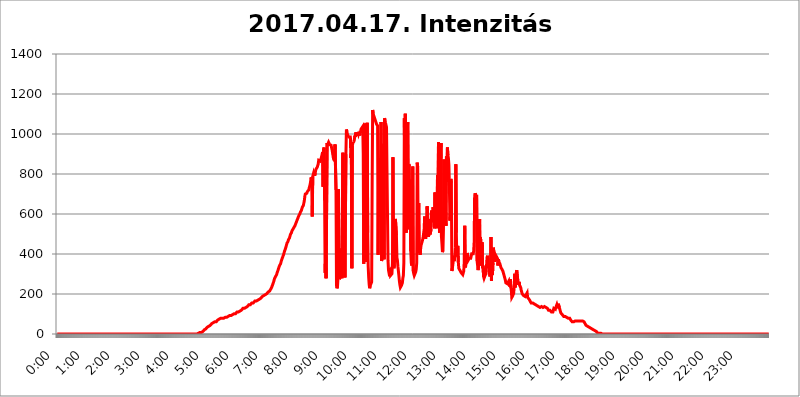
| Category | 2017.04.17. Intenzitás [W/m^2] |
|---|---|
| 0.0 | 0 |
| 0.0006944444444444445 | 0 |
| 0.001388888888888889 | 0 |
| 0.0020833333333333333 | 0 |
| 0.002777777777777778 | 0 |
| 0.003472222222222222 | 0 |
| 0.004166666666666667 | 0 |
| 0.004861111111111111 | 0 |
| 0.005555555555555556 | 0 |
| 0.0062499999999999995 | 0 |
| 0.006944444444444444 | 0 |
| 0.007638888888888889 | 0 |
| 0.008333333333333333 | 0 |
| 0.009027777777777779 | 0 |
| 0.009722222222222222 | 0 |
| 0.010416666666666666 | 0 |
| 0.011111111111111112 | 0 |
| 0.011805555555555555 | 0 |
| 0.012499999999999999 | 0 |
| 0.013194444444444444 | 0 |
| 0.013888888888888888 | 0 |
| 0.014583333333333332 | 0 |
| 0.015277777777777777 | 0 |
| 0.015972222222222224 | 0 |
| 0.016666666666666666 | 0 |
| 0.017361111111111112 | 0 |
| 0.018055555555555557 | 0 |
| 0.01875 | 0 |
| 0.019444444444444445 | 0 |
| 0.02013888888888889 | 0 |
| 0.020833333333333332 | 0 |
| 0.02152777777777778 | 0 |
| 0.022222222222222223 | 0 |
| 0.02291666666666667 | 0 |
| 0.02361111111111111 | 0 |
| 0.024305555555555556 | 0 |
| 0.024999999999999998 | 0 |
| 0.025694444444444447 | 0 |
| 0.02638888888888889 | 0 |
| 0.027083333333333334 | 0 |
| 0.027777777777777776 | 0 |
| 0.02847222222222222 | 0 |
| 0.029166666666666664 | 0 |
| 0.029861111111111113 | 0 |
| 0.030555555555555555 | 0 |
| 0.03125 | 0 |
| 0.03194444444444445 | 0 |
| 0.03263888888888889 | 0 |
| 0.03333333333333333 | 0 |
| 0.034027777777777775 | 0 |
| 0.034722222222222224 | 0 |
| 0.035416666666666666 | 0 |
| 0.036111111111111115 | 0 |
| 0.03680555555555556 | 0 |
| 0.0375 | 0 |
| 0.03819444444444444 | 0 |
| 0.03888888888888889 | 0 |
| 0.03958333333333333 | 0 |
| 0.04027777777777778 | 0 |
| 0.04097222222222222 | 0 |
| 0.041666666666666664 | 0 |
| 0.042361111111111106 | 0 |
| 0.04305555555555556 | 0 |
| 0.043750000000000004 | 0 |
| 0.044444444444444446 | 0 |
| 0.04513888888888889 | 0 |
| 0.04583333333333334 | 0 |
| 0.04652777777777778 | 0 |
| 0.04722222222222222 | 0 |
| 0.04791666666666666 | 0 |
| 0.04861111111111111 | 0 |
| 0.049305555555555554 | 0 |
| 0.049999999999999996 | 0 |
| 0.05069444444444445 | 0 |
| 0.051388888888888894 | 0 |
| 0.052083333333333336 | 0 |
| 0.05277777777777778 | 0 |
| 0.05347222222222222 | 0 |
| 0.05416666666666667 | 0 |
| 0.05486111111111111 | 0 |
| 0.05555555555555555 | 0 |
| 0.05625 | 0 |
| 0.05694444444444444 | 0 |
| 0.057638888888888885 | 0 |
| 0.05833333333333333 | 0 |
| 0.05902777777777778 | 0 |
| 0.059722222222222225 | 0 |
| 0.06041666666666667 | 0 |
| 0.061111111111111116 | 0 |
| 0.06180555555555556 | 0 |
| 0.0625 | 0 |
| 0.06319444444444444 | 0 |
| 0.06388888888888888 | 0 |
| 0.06458333333333334 | 0 |
| 0.06527777777777778 | 0 |
| 0.06597222222222222 | 0 |
| 0.06666666666666667 | 0 |
| 0.06736111111111111 | 0 |
| 0.06805555555555555 | 0 |
| 0.06874999999999999 | 0 |
| 0.06944444444444443 | 0 |
| 0.07013888888888889 | 0 |
| 0.07083333333333333 | 0 |
| 0.07152777777777779 | 0 |
| 0.07222222222222223 | 0 |
| 0.07291666666666667 | 0 |
| 0.07361111111111111 | 0 |
| 0.07430555555555556 | 0 |
| 0.075 | 0 |
| 0.07569444444444444 | 0 |
| 0.0763888888888889 | 0 |
| 0.07708333333333334 | 0 |
| 0.07777777777777778 | 0 |
| 0.07847222222222222 | 0 |
| 0.07916666666666666 | 0 |
| 0.0798611111111111 | 0 |
| 0.08055555555555556 | 0 |
| 0.08125 | 0 |
| 0.08194444444444444 | 0 |
| 0.08263888888888889 | 0 |
| 0.08333333333333333 | 0 |
| 0.08402777777777777 | 0 |
| 0.08472222222222221 | 0 |
| 0.08541666666666665 | 0 |
| 0.08611111111111112 | 0 |
| 0.08680555555555557 | 0 |
| 0.08750000000000001 | 0 |
| 0.08819444444444445 | 0 |
| 0.08888888888888889 | 0 |
| 0.08958333333333333 | 0 |
| 0.09027777777777778 | 0 |
| 0.09097222222222222 | 0 |
| 0.09166666666666667 | 0 |
| 0.09236111111111112 | 0 |
| 0.09305555555555556 | 0 |
| 0.09375 | 0 |
| 0.09444444444444444 | 0 |
| 0.09513888888888888 | 0 |
| 0.09583333333333333 | 0 |
| 0.09652777777777777 | 0 |
| 0.09722222222222222 | 0 |
| 0.09791666666666667 | 0 |
| 0.09861111111111111 | 0 |
| 0.09930555555555555 | 0 |
| 0.09999999999999999 | 0 |
| 0.10069444444444443 | 0 |
| 0.1013888888888889 | 0 |
| 0.10208333333333335 | 0 |
| 0.10277777777777779 | 0 |
| 0.10347222222222223 | 0 |
| 0.10416666666666667 | 0 |
| 0.10486111111111111 | 0 |
| 0.10555555555555556 | 0 |
| 0.10625 | 0 |
| 0.10694444444444444 | 0 |
| 0.1076388888888889 | 0 |
| 0.10833333333333334 | 0 |
| 0.10902777777777778 | 0 |
| 0.10972222222222222 | 0 |
| 0.1111111111111111 | 0 |
| 0.11180555555555556 | 0 |
| 0.11180555555555556 | 0 |
| 0.1125 | 0 |
| 0.11319444444444444 | 0 |
| 0.11388888888888889 | 0 |
| 0.11458333333333333 | 0 |
| 0.11527777777777777 | 0 |
| 0.11597222222222221 | 0 |
| 0.11666666666666665 | 0 |
| 0.1173611111111111 | 0 |
| 0.11805555555555557 | 0 |
| 0.11944444444444445 | 0 |
| 0.12013888888888889 | 0 |
| 0.12083333333333333 | 0 |
| 0.12152777777777778 | 0 |
| 0.12222222222222223 | 0 |
| 0.12291666666666667 | 0 |
| 0.12291666666666667 | 0 |
| 0.12361111111111112 | 0 |
| 0.12430555555555556 | 0 |
| 0.125 | 0 |
| 0.12569444444444444 | 0 |
| 0.12638888888888888 | 0 |
| 0.12708333333333333 | 0 |
| 0.16875 | 0 |
| 0.12847222222222224 | 0 |
| 0.12916666666666668 | 0 |
| 0.12986111111111112 | 0 |
| 0.13055555555555556 | 0 |
| 0.13125 | 0 |
| 0.13194444444444445 | 0 |
| 0.1326388888888889 | 0 |
| 0.13333333333333333 | 0 |
| 0.13402777777777777 | 0 |
| 0.13402777777777777 | 0 |
| 0.13472222222222222 | 0 |
| 0.13541666666666666 | 0 |
| 0.1361111111111111 | 0 |
| 0.13749999999999998 | 0 |
| 0.13819444444444443 | 0 |
| 0.1388888888888889 | 0 |
| 0.13958333333333334 | 0 |
| 0.14027777777777778 | 0 |
| 0.14097222222222222 | 0 |
| 0.14166666666666666 | 0 |
| 0.1423611111111111 | 0 |
| 0.14305555555555557 | 0 |
| 0.14375000000000002 | 0 |
| 0.14444444444444446 | 0 |
| 0.1451388888888889 | 0 |
| 0.1451388888888889 | 0 |
| 0.14652777777777778 | 0 |
| 0.14722222222222223 | 0 |
| 0.14791666666666667 | 0 |
| 0.1486111111111111 | 0 |
| 0.14930555555555555 | 0 |
| 0.15 | 0 |
| 0.15069444444444444 | 0 |
| 0.15138888888888888 | 0 |
| 0.15208333333333332 | 0 |
| 0.15277777777777776 | 0 |
| 0.15347222222222223 | 0 |
| 0.15416666666666667 | 0 |
| 0.15486111111111112 | 0 |
| 0.15555555555555556 | 0 |
| 0.15625 | 0 |
| 0.15694444444444444 | 0 |
| 0.15763888888888888 | 0 |
| 0.15833333333333333 | 0 |
| 0.15902777777777777 | 0 |
| 0.15972222222222224 | 0 |
| 0.16041666666666668 | 0 |
| 0.16111111111111112 | 0 |
| 0.16180555555555556 | 0 |
| 0.1625 | 0 |
| 0.16319444444444445 | 0 |
| 0.1638888888888889 | 0 |
| 0.16458333333333333 | 0 |
| 0.16527777777777777 | 0 |
| 0.16597222222222222 | 0 |
| 0.16666666666666666 | 0 |
| 0.1673611111111111 | 0 |
| 0.16805555555555554 | 0 |
| 0.16874999999999998 | 0 |
| 0.16944444444444443 | 0 |
| 0.17013888888888887 | 0 |
| 0.1708333333333333 | 0 |
| 0.17152777777777775 | 0 |
| 0.17222222222222225 | 0 |
| 0.1729166666666667 | 0 |
| 0.17361111111111113 | 0 |
| 0.17430555555555557 | 0 |
| 0.17500000000000002 | 0 |
| 0.17569444444444446 | 0 |
| 0.1763888888888889 | 0 |
| 0.17708333333333334 | 0 |
| 0.17777777777777778 | 0 |
| 0.17847222222222223 | 0 |
| 0.17916666666666667 | 0 |
| 0.1798611111111111 | 0 |
| 0.18055555555555555 | 0 |
| 0.18125 | 0 |
| 0.18194444444444444 | 0 |
| 0.1826388888888889 | 0 |
| 0.18333333333333335 | 0 |
| 0.1840277777777778 | 0 |
| 0.18472222222222223 | 0 |
| 0.18541666666666667 | 0 |
| 0.18611111111111112 | 0 |
| 0.18680555555555556 | 0 |
| 0.1875 | 0 |
| 0.18819444444444444 | 0 |
| 0.18888888888888888 | 0 |
| 0.18958333333333333 | 0 |
| 0.19027777777777777 | 0 |
| 0.1909722222222222 | 0 |
| 0.19166666666666665 | 0 |
| 0.19236111111111112 | 0 |
| 0.19305555555555554 | 0 |
| 0.19375 | 0 |
| 0.19444444444444445 | 0 |
| 0.1951388888888889 | 3.525 |
| 0.19583333333333333 | 0 |
| 0.19652777777777777 | 3.525 |
| 0.19722222222222222 | 3.525 |
| 0.19791666666666666 | 3.525 |
| 0.1986111111111111 | 3.525 |
| 0.19930555555555554 | 3.525 |
| 0.19999999999999998 | 7.887 |
| 0.20069444444444443 | 7.887 |
| 0.20138888888888887 | 7.887 |
| 0.2020833333333333 | 7.887 |
| 0.2027777777777778 | 12.257 |
| 0.2034722222222222 | 12.257 |
| 0.2041666666666667 | 12.257 |
| 0.20486111111111113 | 12.257 |
| 0.20555555555555557 | 16.636 |
| 0.20625000000000002 | 21.024 |
| 0.20694444444444446 | 21.024 |
| 0.2076388888888889 | 25.419 |
| 0.20833333333333334 | 25.419 |
| 0.20902777777777778 | 29.823 |
| 0.20972222222222223 | 29.823 |
| 0.21041666666666667 | 34.234 |
| 0.2111111111111111 | 34.234 |
| 0.21180555555555555 | 38.653 |
| 0.2125 | 38.653 |
| 0.21319444444444444 | 38.653 |
| 0.2138888888888889 | 43.079 |
| 0.21458333333333335 | 43.079 |
| 0.2152777777777778 | 47.511 |
| 0.21597222222222223 | 47.511 |
| 0.21666666666666667 | 51.951 |
| 0.21736111111111112 | 51.951 |
| 0.21805555555555556 | 56.398 |
| 0.21875 | 56.398 |
| 0.21944444444444444 | 56.398 |
| 0.22013888888888888 | 60.85 |
| 0.22083333333333333 | 60.85 |
| 0.22152777777777777 | 60.85 |
| 0.2222222222222222 | 60.85 |
| 0.22291666666666665 | 60.85 |
| 0.2236111111111111 | 65.31 |
| 0.22430555555555556 | 65.31 |
| 0.225 | 69.775 |
| 0.22569444444444445 | 69.775 |
| 0.2263888888888889 | 74.246 |
| 0.22708333333333333 | 74.246 |
| 0.22777777777777777 | 74.246 |
| 0.22847222222222222 | 78.722 |
| 0.22916666666666666 | 78.722 |
| 0.2298611111111111 | 78.722 |
| 0.23055555555555554 | 78.722 |
| 0.23124999999999998 | 78.722 |
| 0.23194444444444443 | 78.722 |
| 0.23263888888888887 | 78.722 |
| 0.2333333333333333 | 78.722 |
| 0.2340277777777778 | 83.205 |
| 0.2347222222222222 | 83.205 |
| 0.2354166666666667 | 83.205 |
| 0.23611111111111113 | 83.205 |
| 0.23680555555555557 | 83.205 |
| 0.23750000000000002 | 83.205 |
| 0.23819444444444446 | 83.205 |
| 0.2388888888888889 | 87.692 |
| 0.23958333333333334 | 87.692 |
| 0.24027777777777778 | 87.692 |
| 0.24097222222222223 | 87.692 |
| 0.24166666666666667 | 92.184 |
| 0.2423611111111111 | 92.184 |
| 0.24305555555555555 | 92.184 |
| 0.24375 | 92.184 |
| 0.24444444444444446 | 92.184 |
| 0.24513888888888888 | 96.682 |
| 0.24583333333333335 | 96.682 |
| 0.2465277777777778 | 96.682 |
| 0.24722222222222223 | 101.184 |
| 0.24791666666666667 | 101.184 |
| 0.24861111111111112 | 101.184 |
| 0.24930555555555556 | 101.184 |
| 0.25 | 101.184 |
| 0.25069444444444444 | 105.69 |
| 0.2513888888888889 | 105.69 |
| 0.2520833333333333 | 110.201 |
| 0.25277777777777777 | 110.201 |
| 0.2534722222222222 | 110.201 |
| 0.25416666666666665 | 110.201 |
| 0.2548611111111111 | 114.716 |
| 0.2555555555555556 | 114.716 |
| 0.25625000000000003 | 114.716 |
| 0.2569444444444445 | 119.235 |
| 0.2576388888888889 | 119.235 |
| 0.25833333333333336 | 119.235 |
| 0.2590277777777778 | 123.758 |
| 0.25972222222222224 | 123.758 |
| 0.2604166666666667 | 128.284 |
| 0.2611111111111111 | 128.284 |
| 0.26180555555555557 | 128.284 |
| 0.2625 | 128.284 |
| 0.26319444444444445 | 132.814 |
| 0.2638888888888889 | 132.814 |
| 0.26458333333333334 | 132.814 |
| 0.2652777777777778 | 137.347 |
| 0.2659722222222222 | 137.347 |
| 0.26666666666666666 | 137.347 |
| 0.2673611111111111 | 141.884 |
| 0.26805555555555555 | 141.884 |
| 0.26875 | 146.423 |
| 0.26944444444444443 | 146.423 |
| 0.2701388888888889 | 146.423 |
| 0.2708333333333333 | 146.423 |
| 0.27152777777777776 | 150.964 |
| 0.2722222222222222 | 150.964 |
| 0.27291666666666664 | 155.509 |
| 0.2736111111111111 | 155.509 |
| 0.2743055555555555 | 155.509 |
| 0.27499999999999997 | 155.509 |
| 0.27569444444444446 | 160.056 |
| 0.27638888888888885 | 160.056 |
| 0.27708333333333335 | 164.605 |
| 0.2777777777777778 | 164.605 |
| 0.27847222222222223 | 164.605 |
| 0.2791666666666667 | 164.605 |
| 0.2798611111111111 | 169.156 |
| 0.28055555555555556 | 169.156 |
| 0.28125 | 169.156 |
| 0.28194444444444444 | 173.709 |
| 0.2826388888888889 | 173.709 |
| 0.2833333333333333 | 173.709 |
| 0.28402777777777777 | 178.264 |
| 0.2847222222222222 | 178.264 |
| 0.28541666666666665 | 178.264 |
| 0.28611111111111115 | 182.82 |
| 0.28680555555555554 | 182.82 |
| 0.28750000000000003 | 187.378 |
| 0.2881944444444445 | 187.378 |
| 0.2888888888888889 | 187.378 |
| 0.28958333333333336 | 191.937 |
| 0.2902777777777778 | 191.937 |
| 0.29097222222222224 | 191.937 |
| 0.2916666666666667 | 196.497 |
| 0.2923611111111111 | 196.497 |
| 0.29305555555555557 | 201.058 |
| 0.29375 | 201.058 |
| 0.29444444444444445 | 205.62 |
| 0.2951388888888889 | 205.62 |
| 0.29583333333333334 | 210.182 |
| 0.2965277777777778 | 210.182 |
| 0.2972222222222222 | 210.182 |
| 0.29791666666666666 | 214.746 |
| 0.2986111111111111 | 219.309 |
| 0.29930555555555555 | 223.873 |
| 0.3 | 228.436 |
| 0.30069444444444443 | 233 |
| 0.3013888888888889 | 237.564 |
| 0.3020833333333333 | 246.689 |
| 0.30277777777777776 | 251.251 |
| 0.3034722222222222 | 260.373 |
| 0.30416666666666664 | 269.49 |
| 0.3048611111111111 | 278.603 |
| 0.3055555555555555 | 283.156 |
| 0.30624999999999997 | 287.709 |
| 0.3069444444444444 | 292.259 |
| 0.3076388888888889 | 296.808 |
| 0.30833333333333335 | 305.898 |
| 0.3090277777777778 | 310.44 |
| 0.30972222222222223 | 319.517 |
| 0.3104166666666667 | 328.584 |
| 0.3111111111111111 | 333.113 |
| 0.31180555555555556 | 342.162 |
| 0.3125 | 346.682 |
| 0.31319444444444444 | 351.198 |
| 0.3138888888888889 | 360.221 |
| 0.3145833333333333 | 369.23 |
| 0.31527777777777777 | 373.729 |
| 0.3159722222222222 | 382.715 |
| 0.31666666666666665 | 387.202 |
| 0.31736111111111115 | 396.164 |
| 0.31805555555555554 | 405.108 |
| 0.31875000000000003 | 414.035 |
| 0.3194444444444445 | 418.492 |
| 0.3201388888888889 | 427.39 |
| 0.32083333333333336 | 436.27 |
| 0.3215277777777778 | 445.129 |
| 0.32222222222222224 | 453.968 |
| 0.3229166666666667 | 458.38 |
| 0.3236111111111111 | 462.786 |
| 0.32430555555555557 | 471.582 |
| 0.325 | 475.972 |
| 0.32569444444444445 | 480.356 |
| 0.3263888888888889 | 489.108 |
| 0.32708333333333334 | 497.836 |
| 0.3277777777777778 | 502.192 |
| 0.3284722222222222 | 506.542 |
| 0.32916666666666666 | 515.223 |
| 0.3298611111111111 | 515.223 |
| 0.33055555555555555 | 523.88 |
| 0.33125 | 528.2 |
| 0.33194444444444443 | 532.513 |
| 0.3326388888888889 | 536.82 |
| 0.3333333333333333 | 541.121 |
| 0.3340277777777778 | 545.416 |
| 0.3347222222222222 | 553.986 |
| 0.3354166666666667 | 558.261 |
| 0.3361111111111111 | 566.793 |
| 0.3368055555555556 | 571.049 |
| 0.33749999999999997 | 579.542 |
| 0.33819444444444446 | 583.779 |
| 0.33888888888888885 | 592.233 |
| 0.33958333333333335 | 596.45 |
| 0.34027777777777773 | 600.661 |
| 0.34097222222222223 | 609.062 |
| 0.3416666666666666 | 613.252 |
| 0.3423611111111111 | 617.436 |
| 0.3430555555555555 | 625.784 |
| 0.34375 | 634.105 |
| 0.3444444444444445 | 638.256 |
| 0.3451388888888889 | 642.4 |
| 0.3458333333333334 | 654.791 |
| 0.34652777777777777 | 667.123 |
| 0.34722222222222227 | 687.544 |
| 0.34791666666666665 | 699.717 |
| 0.34861111111111115 | 703.762 |
| 0.34930555555555554 | 703.762 |
| 0.35000000000000003 | 703.762 |
| 0.3506944444444444 | 711.832 |
| 0.3513888888888889 | 715.858 |
| 0.3520833333333333 | 715.858 |
| 0.3527777777777778 | 719.877 |
| 0.3534722222222222 | 731.896 |
| 0.3541666666666667 | 739.877 |
| 0.3548611111111111 | 751.803 |
| 0.35555555555555557 | 767.62 |
| 0.35625 | 783.342 |
| 0.35694444444444445 | 751.803 |
| 0.3576388888888889 | 588.009 |
| 0.35833333333333334 | 787.258 |
| 0.3590277777777778 | 787.258 |
| 0.3597222222222222 | 806.757 |
| 0.36041666666666666 | 798.974 |
| 0.3611111111111111 | 791.169 |
| 0.36180555555555555 | 806.757 |
| 0.3625 | 818.392 |
| 0.36319444444444443 | 826.123 |
| 0.3638888888888889 | 829.981 |
| 0.3645833333333333 | 833.834 |
| 0.3652777777777778 | 841.526 |
| 0.3659722222222222 | 849.199 |
| 0.3666666666666667 | 868.305 |
| 0.3673611111111111 | 872.114 |
| 0.3680555555555556 | 868.305 |
| 0.36874999999999997 | 864.493 |
| 0.36944444444444446 | 868.305 |
| 0.37013888888888885 | 879.719 |
| 0.37083333333333335 | 887.309 |
| 0.37152777777777773 | 883.516 |
| 0.37222222222222223 | 909.996 |
| 0.3729166666666666 | 735.89 |
| 0.3736111111111111 | 925.06 |
| 0.3743055555555555 | 932.576 |
| 0.375 | 667.123 |
| 0.3756944444444445 | 305.898 |
| 0.3763888888888889 | 391.685 |
| 0.3770833333333334 | 278.603 |
| 0.37777777777777777 | 283.156 |
| 0.37847222222222227 | 955.071 |
| 0.37916666666666665 | 947.58 |
| 0.37986111111111115 | 947.58 |
| 0.38055555555555554 | 958.814 |
| 0.38125000000000003 | 955.071 |
| 0.3819444444444444 | 947.58 |
| 0.3826388888888889 | 943.832 |
| 0.3833333333333333 | 943.832 |
| 0.3840277777777778 | 943.832 |
| 0.3847222222222222 | 932.576 |
| 0.3854166666666667 | 921.298 |
| 0.3861111111111111 | 921.298 |
| 0.38680555555555557 | 921.298 |
| 0.3875 | 875.918 |
| 0.38819444444444445 | 872.114 |
| 0.3888888888888889 | 864.493 |
| 0.38958333333333334 | 947.58 |
| 0.3902777777777778 | 943.832 |
| 0.3909722222222222 | 719.877 |
| 0.39166666666666666 | 242.127 |
| 0.3923611111111111 | 228.436 |
| 0.39305555555555555 | 237.564 |
| 0.39375 | 278.603 |
| 0.39444444444444443 | 723.889 |
| 0.3951388888888889 | 310.44 |
| 0.3958333333333333 | 274.047 |
| 0.3965277777777778 | 274.047 |
| 0.3972222222222222 | 287.709 |
| 0.3979166666666667 | 427.39 |
| 0.3986111111111111 | 324.052 |
| 0.3993055555555556 | 278.603 |
| 0.39999999999999997 | 283.156 |
| 0.40069444444444446 | 906.223 |
| 0.40138888888888885 | 328.584 |
| 0.40208333333333335 | 414.035 |
| 0.40277777777777773 | 558.261 |
| 0.40347222222222223 | 283.156 |
| 0.4041666666666666 | 283.156 |
| 0.4048611111111111 | 898.668 |
| 0.4055555555555555 | 1022.323 |
| 0.40625 | 1011.118 |
| 0.4069444444444445 | 999.916 |
| 0.4076388888888889 | 992.448 |
| 0.4083333333333334 | 988.714 |
| 0.40902777777777777 | 984.98 |
| 0.40972222222222227 | 981.244 |
| 0.41041666666666665 | 981.244 |
| 0.41111111111111115 | 984.98 |
| 0.41180555555555554 | 879.719 |
| 0.41250000000000003 | 902.447 |
| 0.4131944444444444 | 328.584 |
| 0.4138888888888889 | 940.082 |
| 0.4145833333333333 | 955.071 |
| 0.4152777777777778 | 955.071 |
| 0.4159722222222222 | 962.555 |
| 0.4166666666666667 | 970.034 |
| 0.4173611111111111 | 992.448 |
| 0.41805555555555557 | 984.98 |
| 0.41875 | 1007.383 |
| 0.41944444444444445 | 992.448 |
| 0.4201388888888889 | 1007.383 |
| 0.42083333333333334 | 992.448 |
| 0.4215277777777778 | 1007.383 |
| 0.4222222222222222 | 999.916 |
| 0.42291666666666666 | 1011.118 |
| 0.4236111111111111 | 1007.383 |
| 0.42430555555555555 | 992.448 |
| 0.425 | 1014.852 |
| 0.42569444444444443 | 1007.383 |
| 0.4263888888888889 | 1026.06 |
| 0.4270833333333333 | 1026.06 |
| 0.4277777777777778 | 1022.323 |
| 0.4284722222222222 | 1037.277 |
| 0.4291666666666667 | 902.447 |
| 0.4298611111111111 | 351.198 |
| 0.4305555555555556 | 1037.277 |
| 0.43124999999999997 | 1052.255 |
| 0.43194444444444446 | 1037.277 |
| 0.43263888888888885 | 1029.798 |
| 0.43333333333333335 | 360.221 |
| 0.43402777777777773 | 588.009 |
| 0.43472222222222223 | 1056.004 |
| 0.4354166666666666 | 506.542 |
| 0.4361111111111111 | 337.639 |
| 0.4368055555555555 | 283.156 |
| 0.4375 | 246.689 |
| 0.4381944444444445 | 228.436 |
| 0.4388888888888889 | 242.127 |
| 0.4395833333333334 | 237.564 |
| 0.44027777777777777 | 242.127 |
| 0.44097222222222227 | 260.373 |
| 0.44166666666666665 | 747.834 |
| 0.44236111111111115 | 1120.238 |
| 0.44305555555555554 | 1101.226 |
| 0.44375000000000003 | 1093.653 |
| 0.4444444444444444 | 1086.097 |
| 0.4451388888888889 | 1082.324 |
| 0.4458333333333333 | 1071.027 |
| 0.4465277777777778 | 1063.51 |
| 0.4472222222222222 | 1056.004 |
| 0.4479166666666667 | 1048.508 |
| 0.4486111111111111 | 1044.762 |
| 0.44930555555555557 | 1041.019 |
| 0.45 | 396.164 |
| 0.45069444444444445 | 810.641 |
| 0.4513888888888889 | 868.305 |
| 0.45208333333333334 | 822.26 |
| 0.4527777777777778 | 588.009 |
| 0.4534722222222222 | 879.719 |
| 0.45416666666666666 | 1059.756 |
| 0.4548611111111111 | 364.728 |
| 0.45555555555555555 | 378.224 |
| 0.45625 | 387.202 |
| 0.45694444444444443 | 422.943 |
| 0.4576388888888889 | 951.327 |
| 0.4583333333333333 | 373.729 |
| 0.4590277777777778 | 1078.555 |
| 0.4597222222222222 | 1071.027 |
| 0.4604166666666667 | 1056.004 |
| 0.4611111111111111 | 1044.762 |
| 0.4618055555555556 | 1033.537 |
| 0.46249999999999997 | 1037.277 |
| 0.46319444444444446 | 1033.537 |
| 0.46388888888888885 | 369.23 |
| 0.46458333333333335 | 319.517 |
| 0.46527777777777773 | 305.898 |
| 0.46597222222222223 | 305.898 |
| 0.4666666666666666 | 314.98 |
| 0.4673611111111111 | 292.259 |
| 0.4680555555555555 | 287.709 |
| 0.46875 | 296.808 |
| 0.4694444444444445 | 301.354 |
| 0.4701388888888889 | 355.712 |
| 0.4708333333333334 | 883.516 |
| 0.47152777777777777 | 342.162 |
| 0.47222222222222227 | 328.584 |
| 0.47291666666666665 | 346.682 |
| 0.47361111111111115 | 549.704 |
| 0.47430555555555554 | 575.299 |
| 0.47500000000000003 | 579.542 |
| 0.4756944444444444 | 493.475 |
| 0.4763888888888889 | 382.715 |
| 0.4770833333333333 | 369.23 |
| 0.4777777777777778 | 337.639 |
| 0.4784722222222222 | 333.113 |
| 0.4791666666666667 | 292.259 |
| 0.4798611111111111 | 264.932 |
| 0.48055555555555557 | 246.689 |
| 0.48125 | 233 |
| 0.48194444444444445 | 233 |
| 0.4826388888888889 | 242.127 |
| 0.48333333333333334 | 246.689 |
| 0.4840277777777778 | 255.813 |
| 0.4847222222222222 | 278.603 |
| 0.48541666666666666 | 292.259 |
| 0.4861111111111111 | 355.712 |
| 0.48680555555555555 | 1078.555 |
| 0.4875 | 747.834 |
| 0.48819444444444443 | 1101.226 |
| 0.4888888888888889 | 691.608 |
| 0.4895833333333333 | 506.542 |
| 0.4902777777777778 | 625.784 |
| 0.4909722222222222 | 1033.537 |
| 0.4916666666666667 | 1059.756 |
| 0.4923611111111111 | 523.88 |
| 0.4930555555555556 | 849.199 |
| 0.49374999999999997 | 837.682 |
| 0.49444444444444446 | 549.704 |
| 0.49513888888888885 | 771.559 |
| 0.49583333333333335 | 414.035 |
| 0.49652777777777773 | 355.712 |
| 0.49722222222222223 | 342.162 |
| 0.4979166666666666 | 373.729 |
| 0.4986111111111111 | 837.682 |
| 0.4993055555555555 | 314.98 |
| 0.5 | 301.354 |
| 0.5006944444444444 | 292.259 |
| 0.5013888888888889 | 292.259 |
| 0.5020833333333333 | 296.808 |
| 0.5027777777777778 | 310.44 |
| 0.5034722222222222 | 324.052 |
| 0.5041666666666667 | 355.712 |
| 0.5048611111111111 | 856.855 |
| 0.5055555555555555 | 833.834 |
| 0.50625 | 409.574 |
| 0.5069444444444444 | 654.791 |
| 0.5076388888888889 | 405.108 |
| 0.5083333333333333 | 414.035 |
| 0.5090277777777777 | 396.164 |
| 0.5097222222222222 | 431.833 |
| 0.5104166666666666 | 445.129 |
| 0.5111111111111112 | 449.551 |
| 0.5118055555555555 | 449.551 |
| 0.5125000000000001 | 471.582 |
| 0.5131944444444444 | 484.735 |
| 0.513888888888889 | 480.356 |
| 0.5145833333333333 | 523.88 |
| 0.5152777777777778 | 588.009 |
| 0.5159722222222222 | 506.542 |
| 0.5166666666666667 | 475.972 |
| 0.517361111111111 | 502.192 |
| 0.5180555555555556 | 484.735 |
| 0.5187499999999999 | 638.256 |
| 0.5194444444444445 | 609.062 |
| 0.5201388888888888 | 609.062 |
| 0.5208333333333334 | 484.735 |
| 0.5215277777777778 | 575.299 |
| 0.5222222222222223 | 532.513 |
| 0.5229166666666667 | 497.836 |
| 0.5236111111111111 | 497.836 |
| 0.5243055555555556 | 523.88 |
| 0.525 | 617.436 |
| 0.5256944444444445 | 592.233 |
| 0.5263888888888889 | 558.261 |
| 0.5270833333333333 | 634.105 |
| 0.5277777777777778 | 625.784 |
| 0.5284722222222222 | 566.793 |
| 0.5291666666666667 | 528.2 |
| 0.5298611111111111 | 707.8 |
| 0.5305555555555556 | 541.121 |
| 0.53125 | 625.784 |
| 0.5319444444444444 | 596.45 |
| 0.5326388888888889 | 528.2 |
| 0.5333333333333333 | 795.074 |
| 0.5340277777777778 | 679.395 |
| 0.5347222222222222 | 958.814 |
| 0.5354166666666667 | 891.099 |
| 0.5361111111111111 | 506.542 |
| 0.5368055555555555 | 913.766 |
| 0.5375 | 849.199 |
| 0.5381944444444444 | 955.071 |
| 0.5388888888888889 | 484.735 |
| 0.5395833333333333 | 449.551 |
| 0.5402777777777777 | 409.574 |
| 0.5409722222222222 | 418.492 |
| 0.5416666666666666 | 523.88 |
| 0.5423611111111112 | 872.114 |
| 0.5430555555555555 | 549.704 |
| 0.5437500000000001 | 579.542 |
| 0.5444444444444444 | 650.667 |
| 0.545138888888889 | 541.121 |
| 0.5458333333333333 | 887.309 |
| 0.5465277777777778 | 759.723 |
| 0.5472222222222222 | 932.576 |
| 0.5479166666666667 | 894.885 |
| 0.548611111111111 | 879.719 |
| 0.5493055555555556 | 845.365 |
| 0.5499999999999999 | 739.877 |
| 0.5506944444444445 | 566.793 |
| 0.5513888888888888 | 604.864 |
| 0.5520833333333334 | 775.492 |
| 0.5527777777777778 | 755.766 |
| 0.5534722222222223 | 314.98 |
| 0.5541666666666667 | 328.584 |
| 0.5548611111111111 | 328.584 |
| 0.5555555555555556 | 369.23 |
| 0.55625 | 391.685 |
| 0.5569444444444445 | 364.728 |
| 0.5576388888888889 | 391.685 |
| 0.5583333333333333 | 431.833 |
| 0.5590277777777778 | 849.199 |
| 0.5597222222222222 | 506.542 |
| 0.5604166666666667 | 387.202 |
| 0.5611111111111111 | 391.685 |
| 0.5618055555555556 | 440.702 |
| 0.5625 | 360.221 |
| 0.5631944444444444 | 328.584 |
| 0.5638888888888889 | 324.052 |
| 0.5645833333333333 | 324.052 |
| 0.5652777777777778 | 314.98 |
| 0.5659722222222222 | 310.44 |
| 0.5666666666666667 | 305.898 |
| 0.5673611111111111 | 305.898 |
| 0.5680555555555555 | 305.898 |
| 0.56875 | 296.808 |
| 0.5694444444444444 | 296.808 |
| 0.5701388888888889 | 314.98 |
| 0.5708333333333333 | 360.221 |
| 0.5715277777777777 | 541.121 |
| 0.5722222222222222 | 333.113 |
| 0.5729166666666666 | 342.162 |
| 0.5736111111111112 | 373.729 |
| 0.5743055555555555 | 364.728 |
| 0.5750000000000001 | 405.108 |
| 0.5756944444444444 | 391.685 |
| 0.576388888888889 | 369.23 |
| 0.5770833333333333 | 369.23 |
| 0.5777777777777778 | 378.224 |
| 0.5784722222222222 | 382.715 |
| 0.5791666666666667 | 378.224 |
| 0.579861111111111 | 378.224 |
| 0.5805555555555556 | 382.715 |
| 0.5812499999999999 | 400.638 |
| 0.5819444444444445 | 405.108 |
| 0.5826388888888888 | 400.638 |
| 0.5833333333333334 | 400.638 |
| 0.5840277777777778 | 414.035 |
| 0.5847222222222223 | 458.38 |
| 0.5854166666666667 | 691.608 |
| 0.5861111111111111 | 703.762 |
| 0.5868055555555556 | 695.666 |
| 0.5875 | 683.473 |
| 0.5881944444444445 | 695.666 |
| 0.5888888888888889 | 364.728 |
| 0.5895833333333333 | 342.162 |
| 0.5902777777777778 | 319.517 |
| 0.5909722222222222 | 324.052 |
| 0.5916666666666667 | 369.23 |
| 0.5923611111111111 | 575.299 |
| 0.5930555555555556 | 342.162 |
| 0.59375 | 484.735 |
| 0.5944444444444444 | 360.221 |
| 0.5951388888888889 | 351.198 |
| 0.5958333333333333 | 458.38 |
| 0.5965277777777778 | 328.584 |
| 0.5972222222222222 | 342.162 |
| 0.5979166666666667 | 287.709 |
| 0.5986111111111111 | 278.603 |
| 0.5993055555555555 | 278.603 |
| 0.6 | 292.259 |
| 0.6006944444444444 | 292.259 |
| 0.6013888888888889 | 301.354 |
| 0.6020833333333333 | 305.898 |
| 0.6027777777777777 | 382.715 |
| 0.6034722222222222 | 391.685 |
| 0.6041666666666666 | 337.639 |
| 0.6048611111111112 | 351.198 |
| 0.6055555555555555 | 333.113 |
| 0.6062500000000001 | 301.354 |
| 0.6069444444444444 | 287.709 |
| 0.607638888888889 | 346.682 |
| 0.6083333333333333 | 484.735 |
| 0.6090277777777778 | 264.932 |
| 0.6097222222222222 | 360.221 |
| 0.6104166666666667 | 296.808 |
| 0.611111111111111 | 355.712 |
| 0.6118055555555556 | 431.833 |
| 0.6124999999999999 | 400.638 |
| 0.6131944444444445 | 360.221 |
| 0.6138888888888888 | 382.715 |
| 0.6145833333333334 | 396.164 |
| 0.6152777777777778 | 391.685 |
| 0.6159722222222223 | 387.202 |
| 0.6166666666666667 | 382.715 |
| 0.6173611111111111 | 378.224 |
| 0.6180555555555556 | 342.162 |
| 0.61875 | 373.729 |
| 0.6194444444444445 | 360.221 |
| 0.6201388888888889 | 360.221 |
| 0.6208333333333333 | 351.198 |
| 0.6215277777777778 | 346.682 |
| 0.6222222222222222 | 333.113 |
| 0.6229166666666667 | 328.584 |
| 0.6236111111111111 | 324.052 |
| 0.6243055555555556 | 319.517 |
| 0.625 | 314.98 |
| 0.6256944444444444 | 310.44 |
| 0.6263888888888889 | 296.808 |
| 0.6270833333333333 | 287.709 |
| 0.6277777777777778 | 287.709 |
| 0.6284722222222222 | 269.49 |
| 0.6291666666666667 | 255.813 |
| 0.6298611111111111 | 251.251 |
| 0.6305555555555555 | 251.251 |
| 0.63125 | 251.251 |
| 0.6319444444444444 | 255.813 |
| 0.6326388888888889 | 255.813 |
| 0.6333333333333333 | 264.932 |
| 0.6340277777777777 | 264.932 |
| 0.6347222222222222 | 237.564 |
| 0.6354166666666666 | 274.047 |
| 0.6361111111111112 | 233 |
| 0.6368055555555555 | 219.309 |
| 0.6375000000000001 | 182.82 |
| 0.6381944444444444 | 187.378 |
| 0.638888888888889 | 191.937 |
| 0.6395833333333333 | 191.937 |
| 0.6402777777777778 | 205.62 |
| 0.6409722222222222 | 251.251 |
| 0.6416666666666667 | 301.354 |
| 0.642361111111111 | 233 |
| 0.6430555555555556 | 251.251 |
| 0.6437499999999999 | 305.898 |
| 0.6444444444444445 | 319.517 |
| 0.6451388888888888 | 324.052 |
| 0.6458333333333334 | 319.517 |
| 0.6465277777777778 | 246.689 |
| 0.6472222222222223 | 246.689 |
| 0.6479166666666667 | 260.373 |
| 0.6486111111111111 | 242.127 |
| 0.6493055555555556 | 237.564 |
| 0.65 | 233 |
| 0.6506944444444445 | 219.309 |
| 0.6513888888888889 | 210.182 |
| 0.6520833333333333 | 201.058 |
| 0.6527777777777778 | 196.497 |
| 0.6534722222222222 | 196.497 |
| 0.6541666666666667 | 191.937 |
| 0.6548611111111111 | 191.937 |
| 0.6555555555555556 | 191.937 |
| 0.65625 | 187.378 |
| 0.6569444444444444 | 191.937 |
| 0.6576388888888889 | 196.497 |
| 0.6583333333333333 | 191.937 |
| 0.6590277777777778 | 205.62 |
| 0.6597222222222222 | 182.82 |
| 0.6604166666666667 | 182.82 |
| 0.6611111111111111 | 178.264 |
| 0.6618055555555555 | 173.709 |
| 0.6625 | 169.156 |
| 0.6631944444444444 | 164.605 |
| 0.6638888888888889 | 160.056 |
| 0.6645833333333333 | 155.509 |
| 0.6652777777777777 | 155.509 |
| 0.6659722222222222 | 155.509 |
| 0.6666666666666666 | 155.509 |
| 0.6673611111111111 | 150.964 |
| 0.6680555555555556 | 150.964 |
| 0.6687500000000001 | 150.964 |
| 0.6694444444444444 | 146.423 |
| 0.6701388888888888 | 146.423 |
| 0.6708333333333334 | 146.423 |
| 0.6715277777777778 | 146.423 |
| 0.6722222222222222 | 141.884 |
| 0.6729166666666666 | 141.884 |
| 0.6736111111111112 | 137.347 |
| 0.6743055555555556 | 137.347 |
| 0.6749999999999999 | 137.347 |
| 0.6756944444444444 | 137.347 |
| 0.6763888888888889 | 132.814 |
| 0.6770833333333334 | 132.814 |
| 0.6777777777777777 | 132.814 |
| 0.6784722222222223 | 132.814 |
| 0.6791666666666667 | 137.347 |
| 0.6798611111111111 | 132.814 |
| 0.6805555555555555 | 132.814 |
| 0.68125 | 132.814 |
| 0.6819444444444445 | 132.814 |
| 0.6826388888888889 | 137.347 |
| 0.6833333333333332 | 137.347 |
| 0.6840277777777778 | 137.347 |
| 0.6847222222222222 | 132.814 |
| 0.6854166666666667 | 132.814 |
| 0.686111111111111 | 132.814 |
| 0.6868055555555556 | 128.284 |
| 0.6875 | 128.284 |
| 0.6881944444444444 | 123.758 |
| 0.688888888888889 | 119.235 |
| 0.6895833333333333 | 119.235 |
| 0.6902777777777778 | 119.235 |
| 0.6909722222222222 | 119.235 |
| 0.6916666666666668 | 114.716 |
| 0.6923611111111111 | 114.716 |
| 0.6930555555555555 | 110.201 |
| 0.69375 | 110.201 |
| 0.6944444444444445 | 110.201 |
| 0.6951388888888889 | 110.201 |
| 0.6958333333333333 | 119.235 |
| 0.6965277777777777 | 128.284 |
| 0.6972222222222223 | 128.284 |
| 0.6979166666666666 | 123.758 |
| 0.6986111111111111 | 123.758 |
| 0.6993055555555556 | 132.814 |
| 0.7000000000000001 | 128.284 |
| 0.7006944444444444 | 146.423 |
| 0.7013888888888888 | 146.423 |
| 0.7020833333333334 | 128.284 |
| 0.7027777777777778 | 150.964 |
| 0.7034722222222222 | 150.964 |
| 0.7041666666666666 | 132.814 |
| 0.7048611111111112 | 123.758 |
| 0.7055555555555556 | 114.716 |
| 0.7062499999999999 | 105.69 |
| 0.7069444444444444 | 101.184 |
| 0.7076388888888889 | 101.184 |
| 0.7083333333333334 | 96.682 |
| 0.7090277777777777 | 96.682 |
| 0.7097222222222223 | 92.184 |
| 0.7104166666666667 | 87.692 |
| 0.7111111111111111 | 83.205 |
| 0.7118055555555555 | 83.205 |
| 0.7125 | 87.692 |
| 0.7131944444444445 | 83.205 |
| 0.7138888888888889 | 87.692 |
| 0.7145833333333332 | 83.205 |
| 0.7152777777777778 | 83.205 |
| 0.7159722222222222 | 83.205 |
| 0.7166666666666667 | 78.722 |
| 0.717361111111111 | 78.722 |
| 0.7180555555555556 | 78.722 |
| 0.71875 | 78.722 |
| 0.7194444444444444 | 78.722 |
| 0.720138888888889 | 69.775 |
| 0.7208333333333333 | 69.775 |
| 0.7215277777777778 | 69.775 |
| 0.7222222222222222 | 60.85 |
| 0.7229166666666668 | 60.85 |
| 0.7236111111111111 | 60.85 |
| 0.7243055555555555 | 60.85 |
| 0.725 | 60.85 |
| 0.7256944444444445 | 56.398 |
| 0.7263888888888889 | 65.31 |
| 0.7270833333333333 | 65.31 |
| 0.7277777777777777 | 65.31 |
| 0.7284722222222223 | 65.31 |
| 0.7291666666666666 | 65.31 |
| 0.7298611111111111 | 65.31 |
| 0.7305555555555556 | 65.31 |
| 0.7312500000000001 | 65.31 |
| 0.7319444444444444 | 65.31 |
| 0.7326388888888888 | 65.31 |
| 0.7333333333333334 | 65.31 |
| 0.7340277777777778 | 65.31 |
| 0.7347222222222222 | 65.31 |
| 0.7354166666666666 | 65.31 |
| 0.7361111111111112 | 65.31 |
| 0.7368055555555556 | 65.31 |
| 0.7374999999999999 | 65.31 |
| 0.7381944444444444 | 60.85 |
| 0.7388888888888889 | 60.85 |
| 0.7395833333333334 | 56.398 |
| 0.7402777777777777 | 51.951 |
| 0.7409722222222223 | 47.511 |
| 0.7416666666666667 | 43.079 |
| 0.7423611111111111 | 43.079 |
| 0.7430555555555555 | 38.653 |
| 0.74375 | 38.653 |
| 0.7444444444444445 | 38.653 |
| 0.7451388888888889 | 34.234 |
| 0.7458333333333332 | 34.234 |
| 0.7465277777777778 | 29.823 |
| 0.7472222222222222 | 29.823 |
| 0.7479166666666667 | 29.823 |
| 0.748611111111111 | 29.823 |
| 0.7493055555555556 | 25.419 |
| 0.75 | 25.419 |
| 0.7506944444444444 | 21.024 |
| 0.751388888888889 | 21.024 |
| 0.7520833333333333 | 21.024 |
| 0.7527777777777778 | 21.024 |
| 0.7534722222222222 | 16.636 |
| 0.7541666666666668 | 16.636 |
| 0.7548611111111111 | 12.257 |
| 0.7555555555555555 | 12.257 |
| 0.75625 | 12.257 |
| 0.7569444444444445 | 7.887 |
| 0.7576388888888889 | 7.887 |
| 0.7583333333333333 | 3.525 |
| 0.7590277777777777 | 3.525 |
| 0.7597222222222223 | 3.525 |
| 0.7604166666666666 | 3.525 |
| 0.7611111111111111 | 3.525 |
| 0.7618055555555556 | 3.525 |
| 0.7625000000000001 | 3.525 |
| 0.7631944444444444 | 3.525 |
| 0.7638888888888888 | 3.525 |
| 0.7645833333333334 | 0 |
| 0.7652777777777778 | 0 |
| 0.7659722222222222 | 0 |
| 0.7666666666666666 | 0 |
| 0.7673611111111112 | 0 |
| 0.7680555555555556 | 0 |
| 0.7687499999999999 | 0 |
| 0.7694444444444444 | 0 |
| 0.7701388888888889 | 0 |
| 0.7708333333333334 | 0 |
| 0.7715277777777777 | 0 |
| 0.7722222222222223 | 0 |
| 0.7729166666666667 | 0 |
| 0.7736111111111111 | 0 |
| 0.7743055555555555 | 0 |
| 0.775 | 0 |
| 0.7756944444444445 | 0 |
| 0.7763888888888889 | 0 |
| 0.7770833333333332 | 0 |
| 0.7777777777777778 | 0 |
| 0.7784722222222222 | 0 |
| 0.7791666666666667 | 0 |
| 0.779861111111111 | 0 |
| 0.7805555555555556 | 0 |
| 0.78125 | 0 |
| 0.7819444444444444 | 0 |
| 0.782638888888889 | 0 |
| 0.7833333333333333 | 0 |
| 0.7840277777777778 | 0 |
| 0.7847222222222222 | 0 |
| 0.7854166666666668 | 0 |
| 0.7861111111111111 | 0 |
| 0.7868055555555555 | 0 |
| 0.7875 | 0 |
| 0.7881944444444445 | 0 |
| 0.7888888888888889 | 0 |
| 0.7895833333333333 | 0 |
| 0.7902777777777777 | 0 |
| 0.7909722222222223 | 0 |
| 0.7916666666666666 | 0 |
| 0.7923611111111111 | 0 |
| 0.7930555555555556 | 0 |
| 0.7937500000000001 | 0 |
| 0.7944444444444444 | 0 |
| 0.7951388888888888 | 0 |
| 0.7958333333333334 | 0 |
| 0.7965277777777778 | 0 |
| 0.7972222222222222 | 0 |
| 0.7979166666666666 | 0 |
| 0.7986111111111112 | 0 |
| 0.7993055555555556 | 0 |
| 0.7999999999999999 | 0 |
| 0.8006944444444444 | 0 |
| 0.8013888888888889 | 0 |
| 0.8020833333333334 | 0 |
| 0.8027777777777777 | 0 |
| 0.8034722222222223 | 0 |
| 0.8041666666666667 | 0 |
| 0.8048611111111111 | 0 |
| 0.8055555555555555 | 0 |
| 0.80625 | 0 |
| 0.8069444444444445 | 0 |
| 0.8076388888888889 | 0 |
| 0.8083333333333332 | 0 |
| 0.8090277777777778 | 0 |
| 0.8097222222222222 | 0 |
| 0.8104166666666667 | 0 |
| 0.811111111111111 | 0 |
| 0.8118055555555556 | 0 |
| 0.8125 | 0 |
| 0.8131944444444444 | 0 |
| 0.813888888888889 | 0 |
| 0.8145833333333333 | 0 |
| 0.8152777777777778 | 0 |
| 0.8159722222222222 | 0 |
| 0.8166666666666668 | 0 |
| 0.8173611111111111 | 0 |
| 0.8180555555555555 | 0 |
| 0.81875 | 0 |
| 0.8194444444444445 | 0 |
| 0.8201388888888889 | 0 |
| 0.8208333333333333 | 0 |
| 0.8215277777777777 | 0 |
| 0.8222222222222223 | 0 |
| 0.8229166666666666 | 0 |
| 0.8236111111111111 | 0 |
| 0.8243055555555556 | 0 |
| 0.8250000000000001 | 0 |
| 0.8256944444444444 | 0 |
| 0.8263888888888888 | 0 |
| 0.8270833333333334 | 0 |
| 0.8277777777777778 | 0 |
| 0.8284722222222222 | 0 |
| 0.8291666666666666 | 0 |
| 0.8298611111111112 | 0 |
| 0.8305555555555556 | 0 |
| 0.8312499999999999 | 0 |
| 0.8319444444444444 | 0 |
| 0.8326388888888889 | 0 |
| 0.8333333333333334 | 0 |
| 0.8340277777777777 | 0 |
| 0.8347222222222223 | 0 |
| 0.8354166666666667 | 0 |
| 0.8361111111111111 | 0 |
| 0.8368055555555555 | 0 |
| 0.8375 | 0 |
| 0.8381944444444445 | 0 |
| 0.8388888888888889 | 0 |
| 0.8395833333333332 | 0 |
| 0.8402777777777778 | 0 |
| 0.8409722222222222 | 0 |
| 0.8416666666666667 | 0 |
| 0.842361111111111 | 0 |
| 0.8430555555555556 | 0 |
| 0.84375 | 0 |
| 0.8444444444444444 | 0 |
| 0.845138888888889 | 0 |
| 0.8458333333333333 | 0 |
| 0.8465277777777778 | 0 |
| 0.8472222222222222 | 0 |
| 0.8479166666666668 | 0 |
| 0.8486111111111111 | 0 |
| 0.8493055555555555 | 0 |
| 0.85 | 0 |
| 0.8506944444444445 | 0 |
| 0.8513888888888889 | 0 |
| 0.8520833333333333 | 0 |
| 0.8527777777777777 | 0 |
| 0.8534722222222223 | 0 |
| 0.8541666666666666 | 0 |
| 0.8548611111111111 | 0 |
| 0.8555555555555556 | 0 |
| 0.8562500000000001 | 0 |
| 0.8569444444444444 | 0 |
| 0.8576388888888888 | 0 |
| 0.8583333333333334 | 0 |
| 0.8590277777777778 | 0 |
| 0.8597222222222222 | 0 |
| 0.8604166666666666 | 0 |
| 0.8611111111111112 | 0 |
| 0.8618055555555556 | 0 |
| 0.8624999999999999 | 0 |
| 0.8631944444444444 | 0 |
| 0.8638888888888889 | 0 |
| 0.8645833333333334 | 0 |
| 0.8652777777777777 | 0 |
| 0.8659722222222223 | 0 |
| 0.8666666666666667 | 0 |
| 0.8673611111111111 | 0 |
| 0.8680555555555555 | 0 |
| 0.86875 | 0 |
| 0.8694444444444445 | 0 |
| 0.8701388888888889 | 0 |
| 0.8708333333333332 | 0 |
| 0.8715277777777778 | 0 |
| 0.8722222222222222 | 0 |
| 0.8729166666666667 | 0 |
| 0.873611111111111 | 0 |
| 0.8743055555555556 | 0 |
| 0.875 | 0 |
| 0.8756944444444444 | 0 |
| 0.876388888888889 | 0 |
| 0.8770833333333333 | 0 |
| 0.8777777777777778 | 0 |
| 0.8784722222222222 | 0 |
| 0.8791666666666668 | 0 |
| 0.8798611111111111 | 0 |
| 0.8805555555555555 | 0 |
| 0.88125 | 0 |
| 0.8819444444444445 | 0 |
| 0.8826388888888889 | 0 |
| 0.8833333333333333 | 0 |
| 0.8840277777777777 | 0 |
| 0.8847222222222223 | 0 |
| 0.8854166666666666 | 0 |
| 0.8861111111111111 | 0 |
| 0.8868055555555556 | 0 |
| 0.8875000000000001 | 0 |
| 0.8881944444444444 | 0 |
| 0.8888888888888888 | 0 |
| 0.8895833333333334 | 0 |
| 0.8902777777777778 | 0 |
| 0.8909722222222222 | 0 |
| 0.8916666666666666 | 0 |
| 0.8923611111111112 | 0 |
| 0.8930555555555556 | 0 |
| 0.8937499999999999 | 0 |
| 0.8944444444444444 | 0 |
| 0.8951388888888889 | 0 |
| 0.8958333333333334 | 0 |
| 0.8965277777777777 | 0 |
| 0.8972222222222223 | 0 |
| 0.8979166666666667 | 0 |
| 0.8986111111111111 | 0 |
| 0.8993055555555555 | 0 |
| 0.9 | 0 |
| 0.9006944444444445 | 0 |
| 0.9013888888888889 | 0 |
| 0.9020833333333332 | 0 |
| 0.9027777777777778 | 0 |
| 0.9034722222222222 | 0 |
| 0.9041666666666667 | 0 |
| 0.904861111111111 | 0 |
| 0.9055555555555556 | 0 |
| 0.90625 | 0 |
| 0.9069444444444444 | 0 |
| 0.907638888888889 | 0 |
| 0.9083333333333333 | 0 |
| 0.9090277777777778 | 0 |
| 0.9097222222222222 | 0 |
| 0.9104166666666668 | 0 |
| 0.9111111111111111 | 0 |
| 0.9118055555555555 | 0 |
| 0.9125 | 0 |
| 0.9131944444444445 | 0 |
| 0.9138888888888889 | 0 |
| 0.9145833333333333 | 0 |
| 0.9152777777777777 | 0 |
| 0.9159722222222223 | 0 |
| 0.9166666666666666 | 0 |
| 0.9173611111111111 | 0 |
| 0.9180555555555556 | 0 |
| 0.9187500000000001 | 0 |
| 0.9194444444444444 | 0 |
| 0.9201388888888888 | 0 |
| 0.9208333333333334 | 0 |
| 0.9215277777777778 | 0 |
| 0.9222222222222222 | 0 |
| 0.9229166666666666 | 0 |
| 0.9236111111111112 | 0 |
| 0.9243055555555556 | 0 |
| 0.9249999999999999 | 0 |
| 0.9256944444444444 | 0 |
| 0.9263888888888889 | 0 |
| 0.9270833333333334 | 0 |
| 0.9277777777777777 | 0 |
| 0.9284722222222223 | 0 |
| 0.9291666666666667 | 0 |
| 0.9298611111111111 | 0 |
| 0.9305555555555555 | 0 |
| 0.93125 | 0 |
| 0.9319444444444445 | 0 |
| 0.9326388888888889 | 0 |
| 0.9333333333333332 | 0 |
| 0.9340277777777778 | 0 |
| 0.9347222222222222 | 0 |
| 0.9354166666666667 | 0 |
| 0.936111111111111 | 0 |
| 0.9368055555555556 | 0 |
| 0.9375 | 0 |
| 0.9381944444444444 | 0 |
| 0.938888888888889 | 0 |
| 0.9395833333333333 | 0 |
| 0.9402777777777778 | 0 |
| 0.9409722222222222 | 0 |
| 0.9416666666666668 | 0 |
| 0.9423611111111111 | 0 |
| 0.9430555555555555 | 0 |
| 0.94375 | 0 |
| 0.9444444444444445 | 0 |
| 0.9451388888888889 | 0 |
| 0.9458333333333333 | 0 |
| 0.9465277777777777 | 0 |
| 0.9472222222222223 | 0 |
| 0.9479166666666666 | 0 |
| 0.9486111111111111 | 0 |
| 0.9493055555555556 | 0 |
| 0.9500000000000001 | 0 |
| 0.9506944444444444 | 0 |
| 0.9513888888888888 | 0 |
| 0.9520833333333334 | 0 |
| 0.9527777777777778 | 0 |
| 0.9534722222222222 | 0 |
| 0.9541666666666666 | 0 |
| 0.9548611111111112 | 0 |
| 0.9555555555555556 | 0 |
| 0.9562499999999999 | 0 |
| 0.9569444444444444 | 0 |
| 0.9576388888888889 | 0 |
| 0.9583333333333334 | 0 |
| 0.9590277777777777 | 0 |
| 0.9597222222222223 | 0 |
| 0.9604166666666667 | 0 |
| 0.9611111111111111 | 0 |
| 0.9618055555555555 | 0 |
| 0.9625 | 0 |
| 0.9631944444444445 | 0 |
| 0.9638888888888889 | 0 |
| 0.9645833333333332 | 0 |
| 0.9652777777777778 | 0 |
| 0.9659722222222222 | 0 |
| 0.9666666666666667 | 0 |
| 0.967361111111111 | 0 |
| 0.9680555555555556 | 0 |
| 0.96875 | 0 |
| 0.9694444444444444 | 0 |
| 0.970138888888889 | 0 |
| 0.9708333333333333 | 0 |
| 0.9715277777777778 | 0 |
| 0.9722222222222222 | 0 |
| 0.9729166666666668 | 0 |
| 0.9736111111111111 | 0 |
| 0.9743055555555555 | 0 |
| 0.975 | 0 |
| 0.9756944444444445 | 0 |
| 0.9763888888888889 | 0 |
| 0.9770833333333333 | 0 |
| 0.9777777777777777 | 0 |
| 0.9784722222222223 | 0 |
| 0.9791666666666666 | 0 |
| 0.9798611111111111 | 0 |
| 0.9805555555555556 | 0 |
| 0.9812500000000001 | 0 |
| 0.9819444444444444 | 0 |
| 0.9826388888888888 | 0 |
| 0.9833333333333334 | 0 |
| 0.9840277777777778 | 0 |
| 0.9847222222222222 | 0 |
| 0.9854166666666666 | 0 |
| 0.9861111111111112 | 0 |
| 0.9868055555555556 | 0 |
| 0.9874999999999999 | 0 |
| 0.9881944444444444 | 0 |
| 0.9888888888888889 | 0 |
| 0.9895833333333334 | 0 |
| 0.9902777777777777 | 0 |
| 0.9909722222222223 | 0 |
| 0.9916666666666667 | 0 |
| 0.9923611111111111 | 0 |
| 0.9930555555555555 | 0 |
| 0.99375 | 0 |
| 0.9944444444444445 | 0 |
| 0.9951388888888889 | 0 |
| 0.9958333333333332 | 0 |
| 0.9965277777777778 | 0 |
| 0.9972222222222222 | 0 |
| 0.9979166666666667 | 0 |
| 0.998611111111111 | 0 |
| 0.9993055555555556 | 0 |